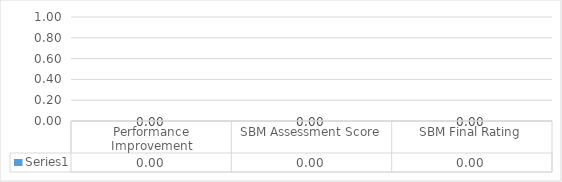
| Category | Series 0 |
|---|---|
| Performance Improvement | 0 |
| SBM Assessment Score | 0 |
| SBM Final Rating | 0 |